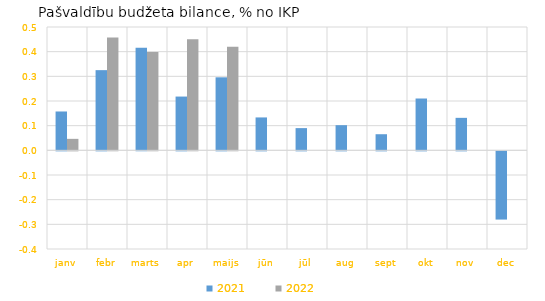
| Category | 2021 | 2022 |
|---|---|---|
| janv | 0.157 | 0.047 |
| febr | 0.325 | 0.457 |
| marts | 0.416 | 0.398 |
| apr | 0.218 | 0.451 |
| maijs | 0.296 | 0.42 |
| jūn | 0.133 | 0 |
| jūl | 0.09 | 0 |
| aug | 0.102 | 0 |
| sept | 0.065 | 0 |
| okt | 0.21 | 0 |
| nov | 0.132 | 0 |
| dec | -0.277 | 0 |